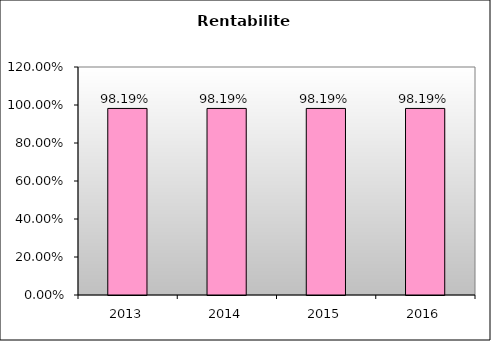
| Category | Series 0 |
|---|---|
| 2013.0 | 0.982 |
| 2014.0 | 0.982 |
| 2015.0 | 0.982 |
| 2016.0 | 0.982 |